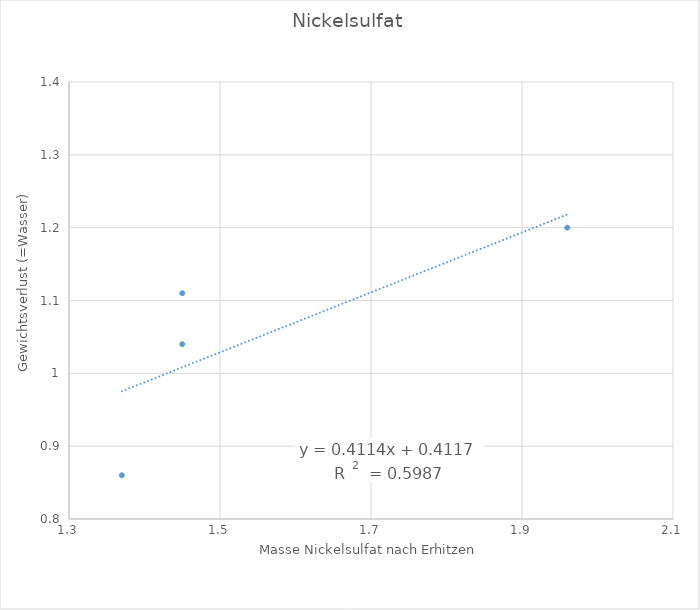
| Category | Series 0 |
|---|---|
| 1.45 | 1.11 |
| 1.45 | 1.04 |
| 1.37 | 0.86 |
| 1.96 | 1.2 |